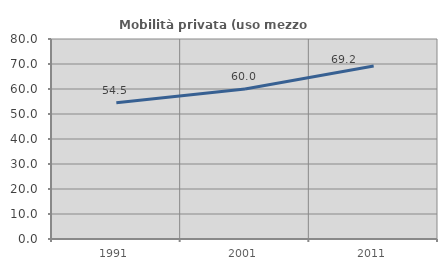
| Category | Mobilità privata (uso mezzo privato) |
|---|---|
| 1991.0 | 54.491 |
| 2001.0 | 60.022 |
| 2011.0 | 69.176 |